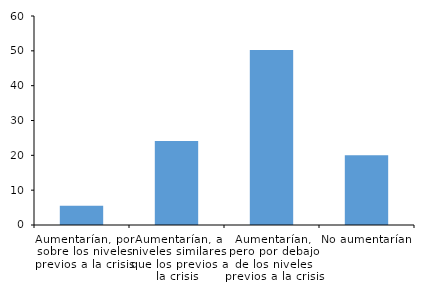
| Category | Series 0 |
|---|---|
| Aumentarían, por sobre los niveles previos a la crisis | 5.541 |
| Aumentarían, a niveles similares que los previos a la crisis | 24.142 |
| Aumentarían, pero por debajo de los niveles previos a la crisis | 50.264 |
| No aumentarían | 20.053 |